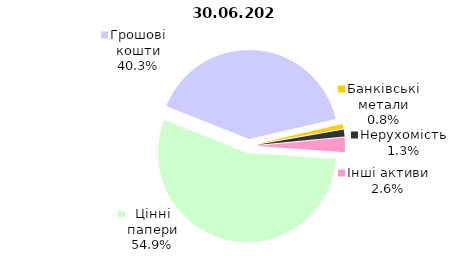
| Category | Всього |
|---|---|
| Цінні папери | 1401.363 |
| Грошові кошти | 1029.364 |
| Банківські метали | 20.695 |
| Нерухомість | 32.61 |
| Інші активи | 67.109 |